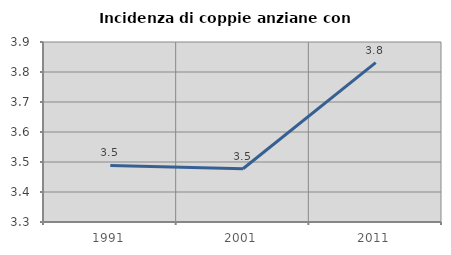
| Category | Incidenza di coppie anziane con figli |
|---|---|
| 1991.0 | 3.488 |
| 2001.0 | 3.477 |
| 2011.0 | 3.831 |